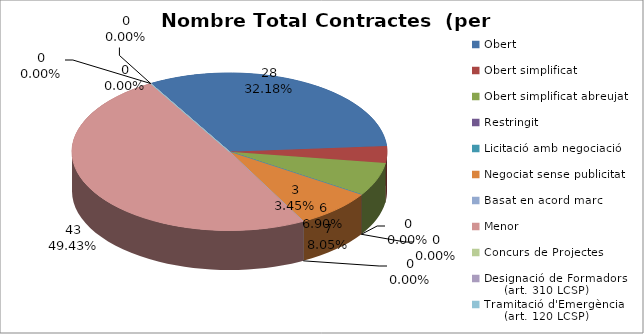
| Category | Nombre Total Contractes |
|---|---|
| Obert | 28 |
| Obert simplificat | 3 |
| Obert simplificat abreujat | 6 |
| Restringit | 0 |
| Licitació amb negociació | 0 |
| Negociat sense publicitat | 7 |
| Basat en acord marc | 0 |
| Menor | 43 |
| Concurs de Projectes | 0 |
| Designació de Formadors
     (art. 310 LCSP) | 0 |
| Tramitació d'Emergència
     (art. 120 LCSP) | 0 |